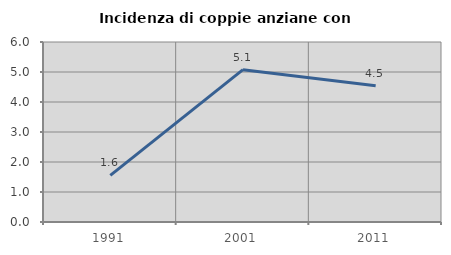
| Category | Incidenza di coppie anziane con figli |
|---|---|
| 1991.0 | 1.556 |
| 2001.0 | 5.078 |
| 2011.0 | 4.545 |